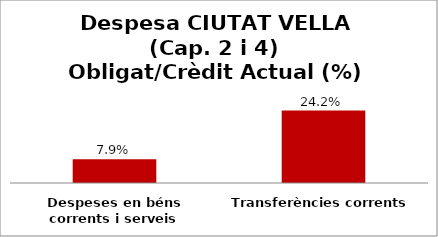
| Category | Series 0 |
|---|---|
| Despeses en béns corrents i serveis | 0.079 |
| Transferències corrents | 0.242 |